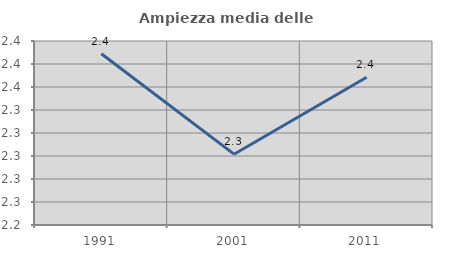
| Category | Ampiezza media delle famiglie |
|---|---|
| 1991.0 | 2.389 |
| 2001.0 | 2.302 |
| 2011.0 | 2.368 |